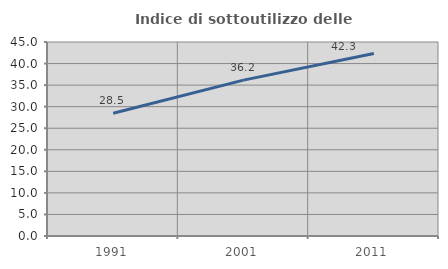
| Category | Indice di sottoutilizzo delle abitazioni  |
|---|---|
| 1991.0 | 28.464 |
| 2001.0 | 36.156 |
| 2011.0 | 42.35 |